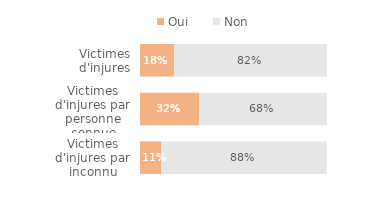
| Category | Oui | Non |
|---|---|---|
| Victimes d'injures par inconnu | 0.115 | 0.885 |
| Victimes d'injures par personne connue | 0.316 | 0.683 |
| Victimes d'injures | 0.184 | 0.816 |